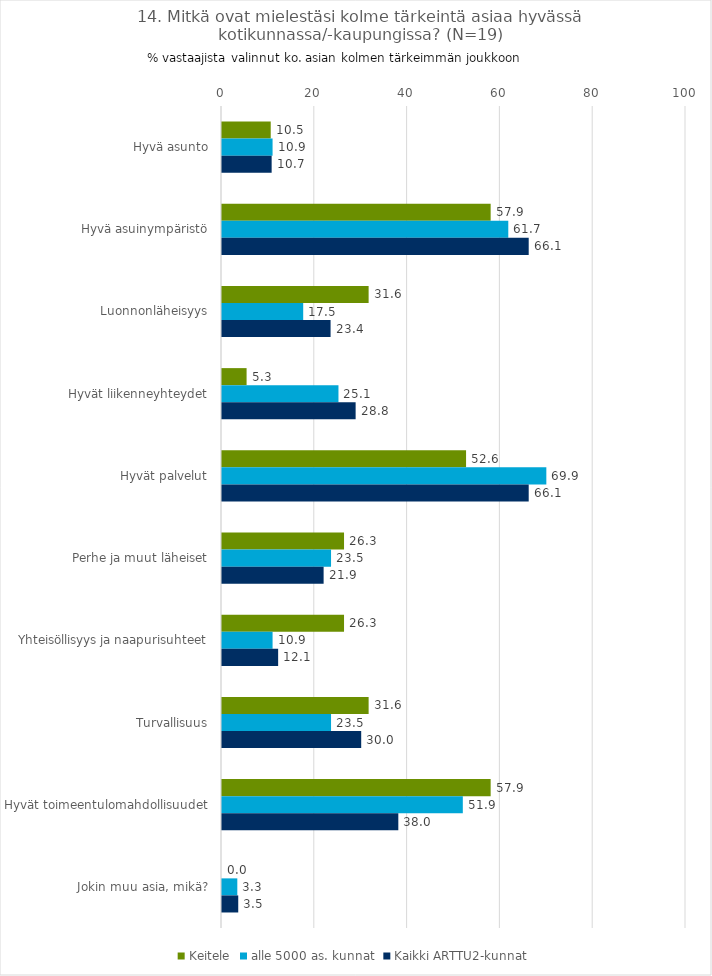
| Category | Keitele | alle 5000 as. kunnat | Kaikki ARTTU2-kunnat |
|---|---|---|---|
| Hyvä asunto | 10.5 | 10.9 | 10.7 |
| Hyvä asuinympäristö | 57.9 | 61.7 | 66.1 |
| Luonnonläheisyys | 31.6 | 17.5 | 23.4 |
| Hyvät liikenneyhteydet | 5.3 | 25.1 | 28.8 |
| Hyvät palvelut | 52.6 | 69.9 | 66.1 |
| Perhe ja muut läheiset | 26.3 | 23.5 | 21.9 |
| Yhteisöllisyys ja naapurisuhteet | 26.3 | 10.9 | 12.1 |
| Turvallisuus | 31.6 | 23.5 | 30 |
| Hyvät toimeentulomahdollisuudet | 57.9 | 51.9 | 38 |
| Jokin muu asia, mikä? | 0 | 3.3 | 3.5 |